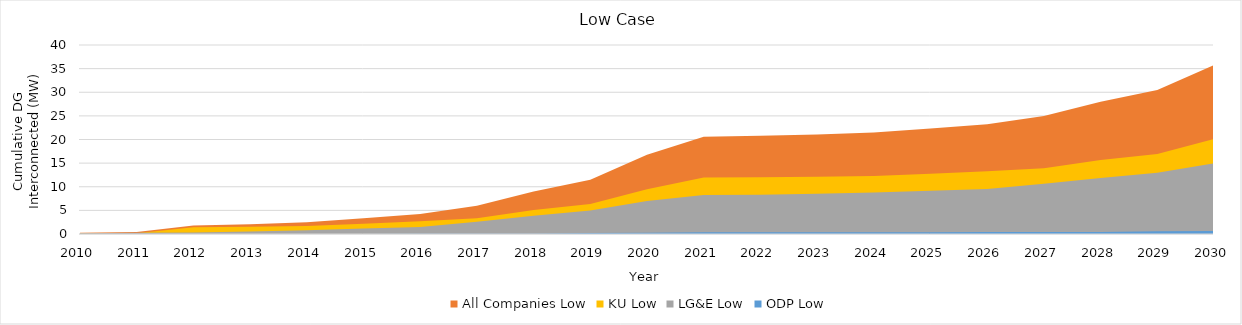
| Category | All Companies Low | KU Low | LG&E Low | ODP Low |
|---|---|---|---|---|
| 2010.0 | 0.25 | 0.11 | 0.139 | 0 |
| 2011.0 | 0.41 | 0.155 | 0.256 | 0 |
| 2012.0 | 1.776 | 1.437 | 0.327 | 0.012 |
| 2013.0 | 2.052 | 1.527 | 0.514 | 0.012 |
| 2014.0 | 2.507 | 1.7 | 0.796 | 0.012 |
| 2015.0 | 3.342 | 2.17 | 1.161 | 0.012 |
| 2016.0 | 4.238 | 2.706 | 1.505 | 0.027 |
| 2017.0 | 5.964 | 3.315 | 2.613 | 0.036 |
| 2018.0 | 8.998 | 5.091 | 3.862 | 0.045 |
| 2019.0 | 11.501 | 6.335 | 4.965 | 0.201 |
| 2020.0 | 16.751 | 9.494 | 6.977 | 0.28 |
| 2021.0 | 20.586 | 11.957 | 8.252 | 0.377 |
| 2022.0 | 20.775 | 12.029 | 8.323 | 0.388 |
| 2023.0 | 21.051 | 12.118 | 8.51 | 0.388 |
| 2024.0 | 21.506 | 12.291 | 8.792 | 0.388 |
| 2025.0 | 22.341 | 12.761 | 9.157 | 0.388 |
| 2026.0 | 23.237 | 13.298 | 9.501 | 0.403 |
| 2027.0 | 24.963 | 13.906 | 10.609 | 0.412 |
| 2028.0 | 27.997 | 15.683 | 11.858 | 0.421 |
| 2029.0 | 30.5 | 16.926 | 12.961 | 0.578 |
| 2030.0 | 35.75 | 20.085 | 14.973 | 0.657 |